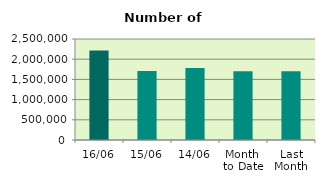
| Category | Series 0 |
|---|---|
| 16/06 | 2214694 |
| 15/06 | 1707264 |
| 14/06 | 1783604 |
| Month 
to Date | 1700627.333 |
| Last
Month | 1704183.636 |